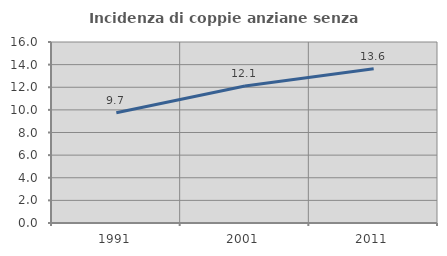
| Category | Incidenza di coppie anziane senza figli  |
|---|---|
| 1991.0 | 9.748 |
| 2001.0 | 12.113 |
| 2011.0 | 13.628 |